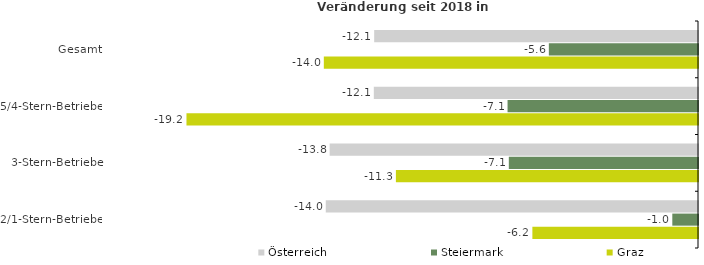
| Category | Österreich | Steiermark | Graz |
|---|---|---|---|
| Gesamt | -12.137 | -5.59 | -14.024 |
| 5/4-Stern-Betriebe | -12.15 | -7.138 | -19.171 |
| 3-Stern-Betriebe | -13.805 | -7.09 | -11.323 |
| 2/1-Stern-Betriebe | -13.951 | -0.963 | -6.207 |